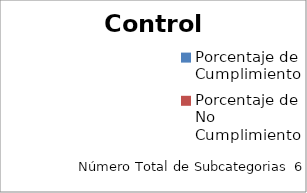
| Category | Control |
|---|---|
| Porcentaje de Cumplimiento | 0 |
| Porcentaje de No Cumplimiento | 0 |
| No Aplica | 0 |